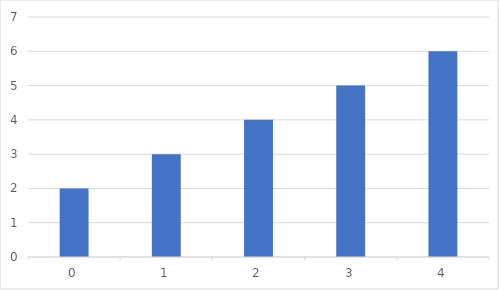
| Category | Series 0 |
|---|---|
| 0.0 | 2 |
| 1.0 | 3 |
| 2.0 | 4 |
| 3.0 | 5 |
| 4.0 | 6 |